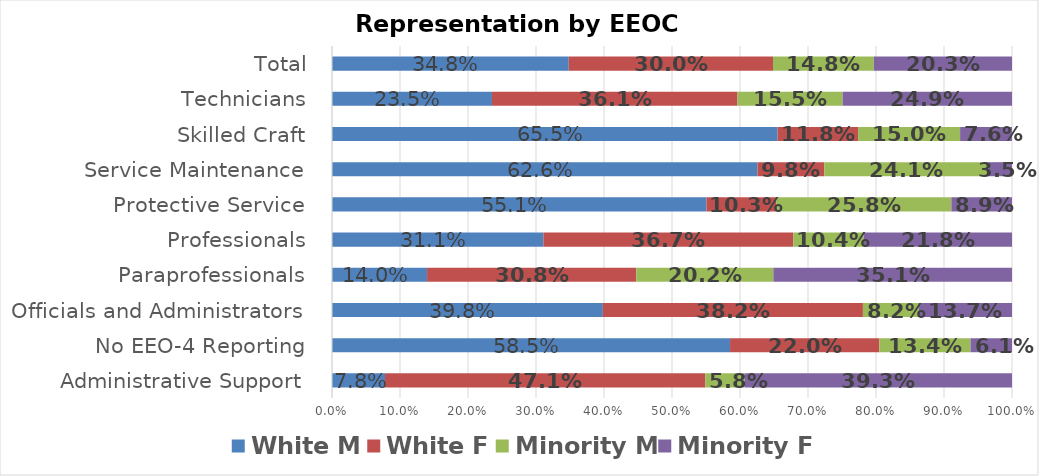
| Category | White M | White F | Minority M | Minority F |
|---|---|---|---|---|
| Administrative Support | 0.078 | 0.471 | 0.058 | 0.393 |
| No EEO-4 Reporting | 0.585 | 0.22 | 0.134 | 0.061 |
| Officials and Administrators | 0.398 | 0.382 | 0.082 | 0.137 |
| Paraprofessionals | 0.14 | 0.308 | 0.202 | 0.351 |
| Professionals | 0.311 | 0.367 | 0.104 | 0.218 |
| Protective Service | 0.551 | 0.103 | 0.258 | 0.089 |
| Service Maintenance | 0.626 | 0.098 | 0.241 | 0.035 |
| Skilled Craft | 0.655 | 0.118 | 0.15 | 0.076 |
| Technicians | 0.235 | 0.361 | 0.155 | 0.249 |
| Total | 0.348 | 0.3 | 0.148 | 0.203 |